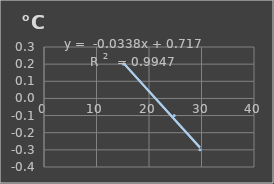
| Category | Temperatura |
|---|---|
| 15.1 | 0.2 |
| 24.8 | -0.1 |
| 29.7 | -0.3 |